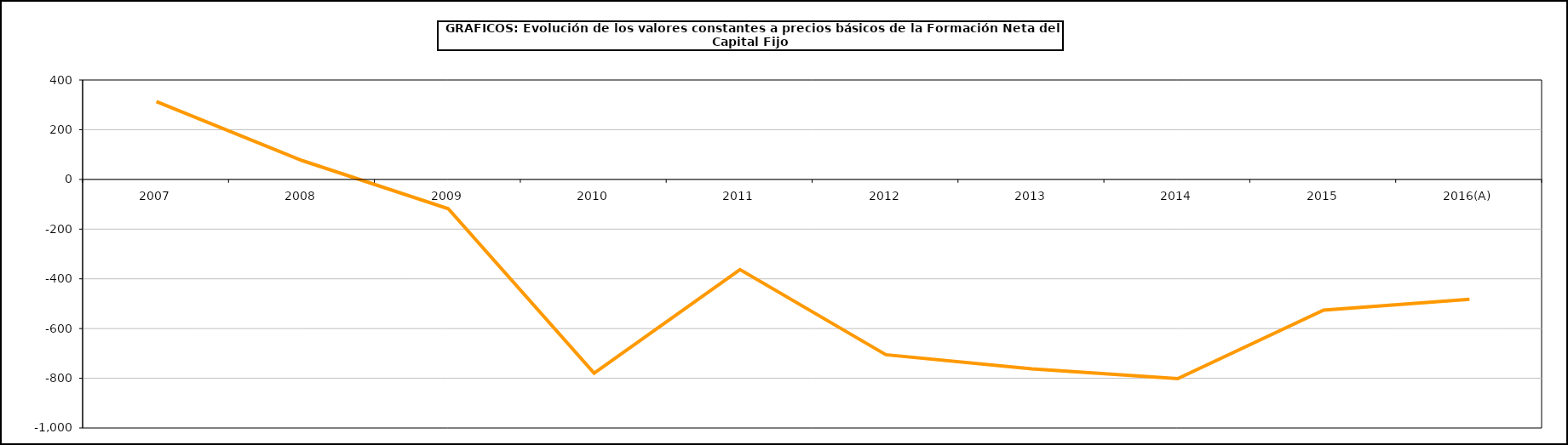
| Category | Formación neta del capital fijo |
|---|---|
| 2007 | 313.234 |
| 2008 | 75.624 |
| 2009 | -117.656 |
| 2010 | -779.502 |
| 2011 | -362.529 |
| 2012 | -705.277 |
| 2013 | -762.083 |
| 2014 | -801.711 |
| 2015 | -525.573 |
| 2016(A) | -481.981 |